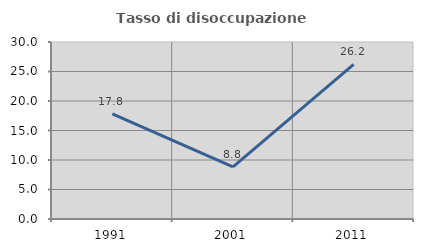
| Category | Tasso di disoccupazione giovanile  |
|---|---|
| 1991.0 | 17.822 |
| 2001.0 | 8.824 |
| 2011.0 | 26.19 |